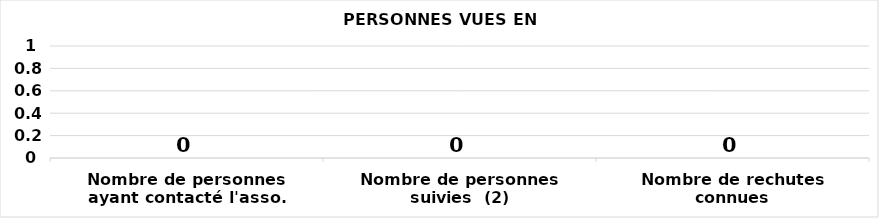
| Category | Series 0 |
|---|---|
| Nombre de personnes ayant contacté l'asso. | 0 |
| Nombre de personnes suivies  (2) | 0 |
| Nombre de rechutes connues | 0 |